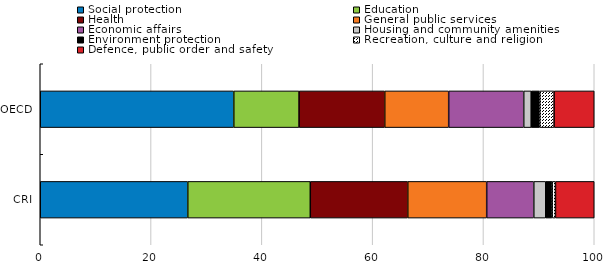
| Category | Social protection | Education | Health | General public services | Economic affairs | Housing and community amenities | Environment protection | Recreation, culture and religion | Defence, public order and safety |
|---|---|---|---|---|---|---|---|---|---|
| CRI | 26.629 | 22.115 | 17.595 | 14.247 | 8.505 | 2.156 | 1.157 | 0.595 | 7.001 |
| OECD | 34.934 | 11.784 | 15.467 | 11.542 | 13.547 | 1.348 | 1.559 | 2.571 | 7.25 |